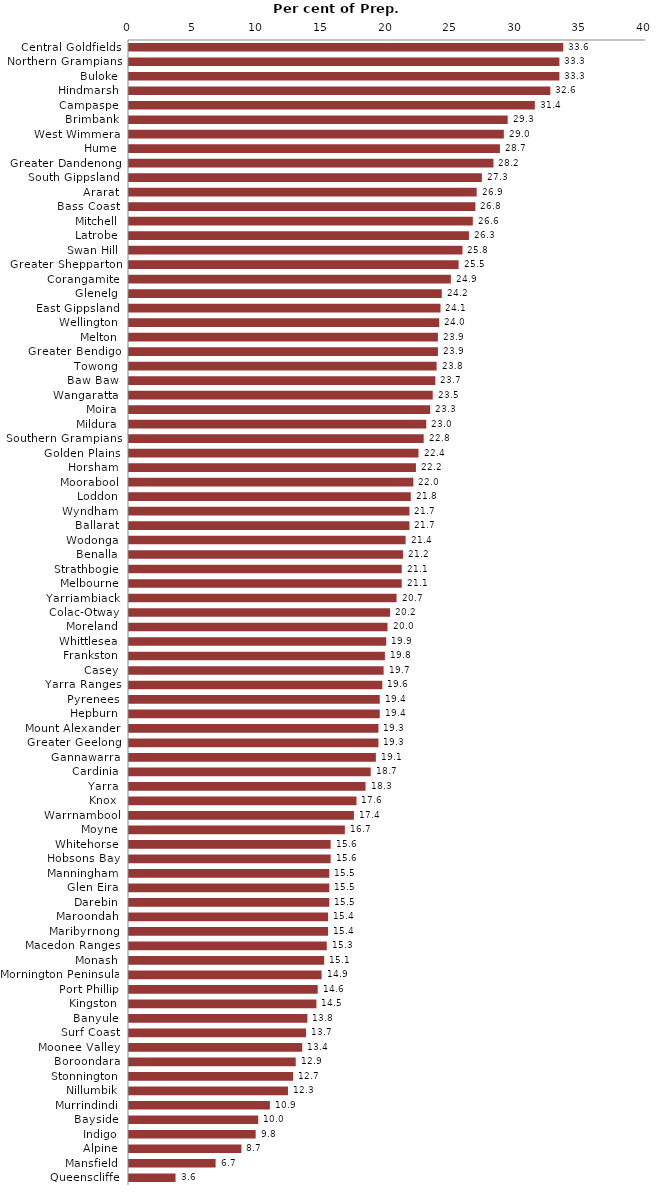
| Category | Series 0 |
|---|---|
| Central Goldfields | 33.6 |
| Northern Grampians | 33.3 |
| Buloke | 33.3 |
| Hindmarsh | 32.6 |
| Campaspe | 31.4 |
| Brimbank | 29.3 |
| West Wimmera | 29 |
| Hume | 28.7 |
| Greater Dandenong | 28.2 |
| South Gippsland | 27.3 |
| Ararat | 26.9 |
| Bass Coast | 26.8 |
| Mitchell | 26.6 |
| Latrobe | 26.3 |
| Swan Hill | 25.8 |
| Greater Shepparton | 25.5 |
| Corangamite | 24.9 |
| Glenelg | 24.2 |
| East Gippsland | 24.1 |
| Wellington | 24 |
| Melton | 23.9 |
| Greater Bendigo | 23.9 |
| Towong | 23.8 |
| Baw Baw | 23.7 |
| Wangaratta | 23.5 |
| Moira | 23.3 |
| Mildura | 23 |
| Southern Grampians | 22.8 |
| Golden Plains | 22.4 |
| Horsham | 22.2 |
| Moorabool | 22 |
| Loddon | 21.8 |
| Wyndham | 21.7 |
| Ballarat | 21.7 |
| Wodonga | 21.4 |
| Benalla | 21.2 |
| Strathbogie | 21.1 |
| Melbourne | 21.1 |
| Yarriambiack | 20.7 |
| Colac-Otway | 20.2 |
| Moreland | 20 |
| Whittlesea | 19.9 |
| Frankston | 19.8 |
| Casey | 19.7 |
| Yarra Ranges | 19.6 |
| Pyrenees | 19.4 |
| Hepburn | 19.4 |
| Mount Alexander | 19.3 |
| Greater Geelong | 19.3 |
| Gannawarra | 19.1 |
| Cardinia | 18.7 |
| Yarra | 18.3 |
| Knox | 17.6 |
| Warrnambool | 17.4 |
| Moyne | 16.7 |
| Whitehorse | 15.6 |
| Hobsons Bay | 15.6 |
| Manningham | 15.5 |
| Glen Eira | 15.5 |
| Darebin | 15.5 |
| Maroondah | 15.4 |
| Maribyrnong | 15.4 |
| Macedon Ranges | 15.3 |
| Monash | 15.1 |
| Mornington Peninsula | 14.9 |
| Port Phillip | 14.6 |
| Kingston | 14.5 |
| Banyule | 13.8 |
| Surf Coast | 13.7 |
| Moonee Valley | 13.4 |
| Boroondara | 12.9 |
| Stonnington | 12.7 |
| Nillumbik | 12.3 |
| Murrindindi | 10.9 |
| Bayside | 10 |
| Indigo | 9.8 |
| Alpine | 8.7 |
| Mansfield | 6.7 |
| Queenscliffe | 3.6 |